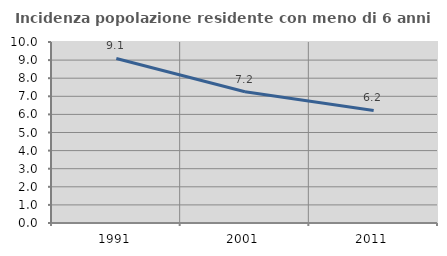
| Category | Incidenza popolazione residente con meno di 6 anni |
|---|---|
| 1991.0 | 9.093 |
| 2001.0 | 7.25 |
| 2011.0 | 6.221 |